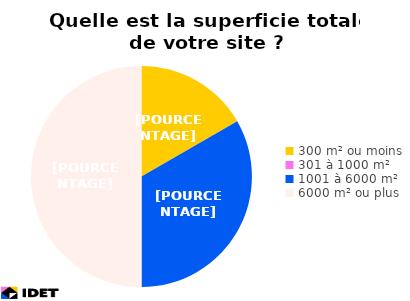
| Category | Series 1 | Series 0 |
|---|---|---|
| 300 m² ou moins | 1 | 1 |
| 301 à 1000 m² | 0 | 0 |
| 1001 à 6000 m² | 2 | 2 |
| 6000 m² ou plus | 3 | 3 |